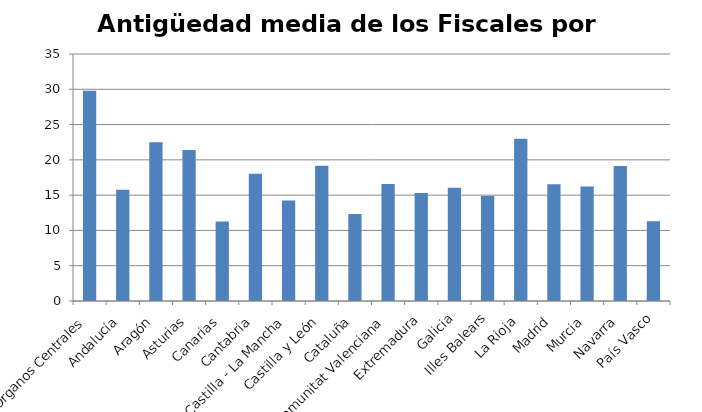
| Category | Series 0 |
|---|---|
| Órganos Centrales | 29.79 |
| Andalucía | 15.77 |
| Aragón | 22.49 |
| Asturias | 21.41 |
| Canarias | 11.27 |
| Cantabria | 18.04 |
| Castilla - La Mancha | 14.25 |
| Castilla y León | 19.18 |
| Cataluña | 12.32 |
| Comunitat Valenciana | 16.58 |
| Extremadura | 15.32 |
| Galicia | 16.03 |
| Illes Balears | 14.88 |
| La Rioja | 23 |
| Madrid | 16.56 |
| Murcia | 16.23 |
| Navarra | 19.14 |
| País Vasco | 11.31 |